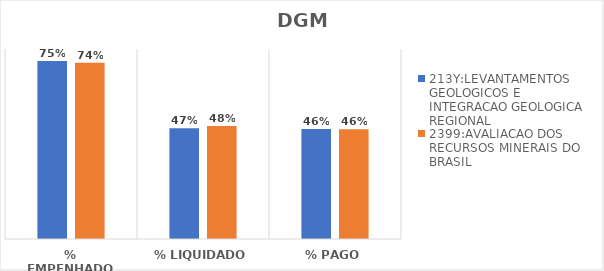
| Category | 213Y:LEVANTAMENTOS GEOLOGICOS E INTEGRACAO GEOLOGICA REGIONAL | 2399:AVALIACAO DOS RECURSOS MINERAIS DO BRASIL |
|---|---|---|
| % EMPENHADO | 0.749 | 0.742 |
| % LIQUIDADO | 0.466 | 0.475 |
| % PAGO | 0.463 | 0.462 |